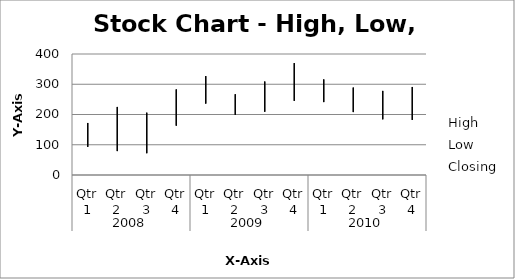
| Category | High | Low | Closing |
|---|---|---|---|
| 0 | 172 | 93 | 111 |
| 1 | 225 | 79 | 94 |
| 2 | 206 | 72 | 205 |
| 3 | 283 | 163 | 273 |
| 4 | 327 | 236 | 241 |
| 5 | 267 | 199 | 230 |
| 6 | 309 | 209 | 283 |
| 7 | 370 | 245 | 273 |
| 8 | 316 | 241 | 258 |
| 9 | 289 | 208 | 226 |
| 10 | 278 | 184 | 224 |
| 11 | 291 | 182 | 253 |